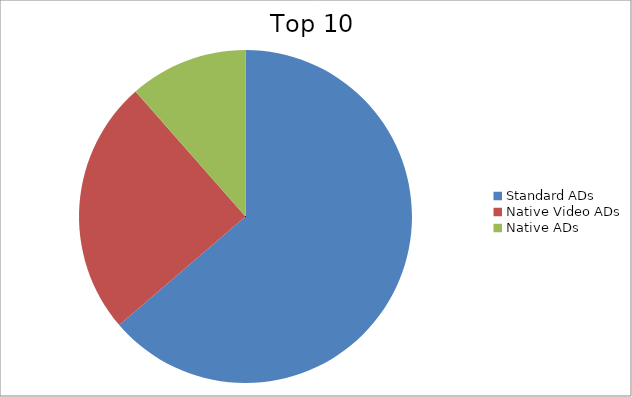
| Category | Series 0 |
|---|---|
| Standard ADs | 63.7 |
| Native Video ADs | 24.82 |
| Native ADs | 11.48 |